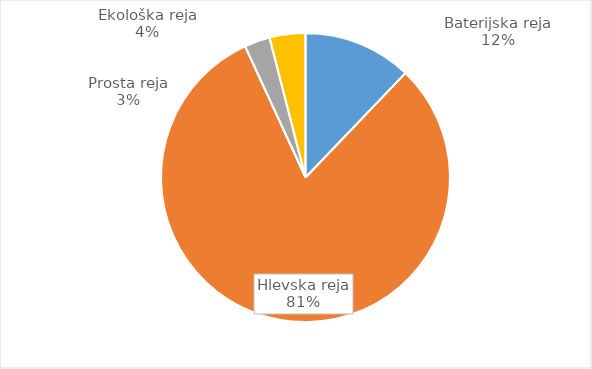
| Category | Količina kosov jajc |
|---|---|
| Baterijska reja | 329354 |
| Hlevska reja | 2195164 |
| Prosta reja | 77430 |
| Ekološka reja | 108800 |